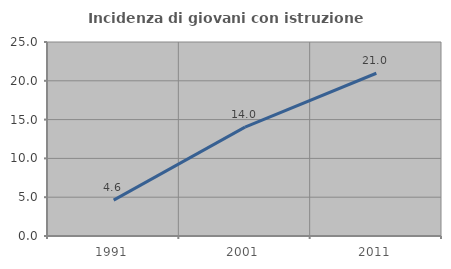
| Category | Incidenza di giovani con istruzione universitaria |
|---|---|
| 1991.0 | 4.616 |
| 2001.0 | 14.025 |
| 2011.0 | 20.974 |